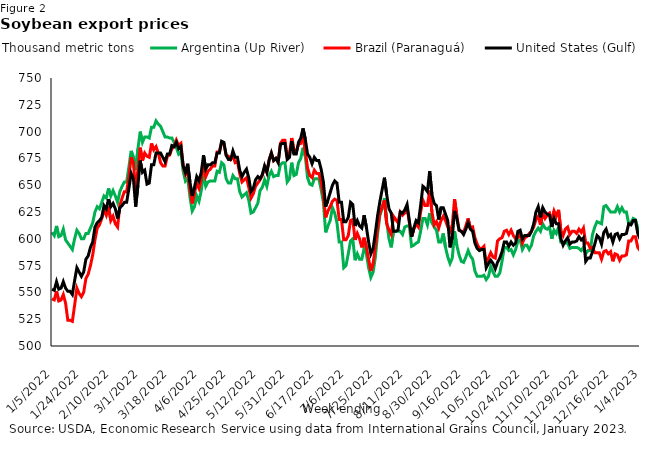
| Category | Argentina (Up River) | Brazil (Paranaguá) | United States (Gulf) |
|---|---|---|---|
| 1/5/22 | 606 | 544 | 553 |
| 1/6/22 | 603 | 543 | 552 |
| 1/7/22 | 612 | 551 | 560 |
| 1/10/22 | 602 | 542 | 553 |
| 1/11/22 | 603 | 543 | 554 |
| 1/12/22 | 609 | 548 | 560 |
| 1/13/22 | 599 | 540 | 554 |
| 1/14/22 | 596 | 524 | 551 |
| 1/17/22 | 593 | 524 | 551 |
| 1/18/22 | 590 | 523 | 548 |
| 1/19/22 | 600 | 538 | 561 |
| 1/20/22 | 608 | 554 | 573 |
| 1/21/22 | 605 | 549 | 569 |
| 1/24/22 | 600 | 546 | 565 |
| 1/25/22 | 600 | 550 | 569 |
| 1/26/22 | 605 | 563 | 581 |
| 1/27/22 | 605 | 567 | 584 |
| 1/28/22 | 610 | 575 | 592 |
| 1/31/22 | 615 | 585 | 597 |
| 2/1/22 | 625 | 599 | 611 |
| 2/2/22 | 630 | 610 | 615 |
| 2/3/22 | 628 | 613 | 617 |
| 2/4/22 | 634 | 619 | 620 |
| 2/7/22 | 640 | 627 | 631 |
| 2/8/22 | 638 | 622 | 628 |
| 2/9/22 | 647 | 630 | 637 |
| 2/10/22 | 640 | 617 | 630 |
| 2/11/22 | 645 | 621 | 633 |
| 2/14/22 | 640 | 614 | 628 |
| 2/15/22 | 634 | 611 | 619 |
| 2/16/22 | 644 | 631 | 629 |
| 2/17/22 | 649 | 638 | 631 |
| 2/18/22 | 653 | 644 | 634 |
| 2/21/22 | 653 | 644 | 634 |
| 2/22/22 | 667 | 658 | 647 |
| 2/23/22 | 682 | 676 | 661 |
| 2/24/22 | 676 | 671 | 656 |
| 2/25/22 | 664 | 645 | 630 |
| 2/28/22 | 684 | 663 | 650 |
| 3/1/22 | 700 | 685 | 673 |
| 3/2/22 | 690 | 673 | 662 |
| 3/3/22 | 695 | 680 | 664 |
| 3/4/22 | 695 | 677 | 651 |
| 3/7/22 | 694 | 676 | 652 |
| 3/8/22 | 704 | 689 | 669 |
| 3/9/22 | 704 | 683 | 669 |
| 3/10/22 | 710 | 686 | 680 |
| 3/11/22 | 707 | 680 | 680 |
| 3/14/22 | 705 | 671 | 680 |
| 3/15/22 | 700 | 668 | 676 |
| 3/16/22 | 695 | 668 | 672 |
| 3/17/22 | 695 | 677 | 679 |
| 3/18/22 | 694 | 678 | 679 |
| 3/21/22 | 694 | 684 | 687 |
| 3/22/22 | 690 | 686 | 686 |
| 3/23/22 | 685 | 692 | 690 |
| 3/24/22 | 679 | 687 | 684 |
| 3/25/22 | 681 | 689 | 686 |
| 3/28/22 | 663 | 668 | 668 |
| 3/29/22 | 654 | 660 | 662 |
| 3/30/22 | 657 | 663 | 670 |
| 3/31/22 | 639 | 646 | 653 |
| 4/1/22 | 626 | 633 | 640 |
| 4/4/22 | 630 | 643 | 648 |
| 4/5/22 | 640 | 652 | 658 |
| 4/6/22 | 635 | 647 | 654 |
| 4/7/22 | 645 | 655 | 662 |
| 4/8/22 | 660 | 669 | 678 |
| 4/11/22 | 649 | 658 | 665 |
| 4/12/22 | 653 | 663 | 669 |
| 4/13/22 | 654 | 665 | 669 |
| 4/14/22 | 654 | 668 | 671 |
| 4/15/22 | 654 | 668 | 671 |
| 4/18/22 | 663 | 681 | 680 |
| 4/19/22 | 662 | 681 | 680 |
| 4/20/22 | 671 | 690 | 691 |
| 4/21/22 | 669 | 689 | 690 |
| 4/22/22 | 656 | 678 | 678 |
| 4/25/22 | 652 | 677 | 674 |
| 4/26/22 | 652 | 674 | 674 |
| 4/27/22 | 659 | 678 | 682 |
| 4/28/22 | 656 | 671 | 676 |
| 4/29/22 | 656 | 672 | 676 |
| 5/2/22 | 644 | 661 | 664 |
| 5/3/22 | 639 | 653 | 658 |
| 5/4/22 | 641 | 655 | 662 |
| 5/5/22 | 643 | 657 | 665 |
| 5/6/22 | 636 | 648 | 657 |
| 5/9/22 | 624 | 638 | 644 |
| 5/10/22 | 625 | 642 | 647 |
| 5/11/22 | 629 | 649 | 655 |
| 5/12/22 | 633 | 652 | 658 |
| 5/13/22 | 645 | 655 | 656 |
| 5/16/22 | 648 | 659 | 660 |
| 5/17/22 | 655 | 667 | 668 |
| 5/18/22 | 649 | 662 | 662 |
| 5/19/22 | 659 | 674 | 673 |
| 5/20/22 | 663 | 680 | 680 |
| 5/23/22 | 658 | 673 | 673 |
| 5/24/22 | 659 | 675 | 675 |
| 5/25/22 | 659 | 672 | 671 |
| 5/26/22 | 669 | 689 | 688 |
| 5/27/22 | 671 | 692 | 689 |
| 5/30/22 | 671 | 692 | 689 |
| 5/31/22 | 653 | 677 | 674 |
| 6/1/22 | 656 | 680 | 676 |
| 6/2/22 | 671 | 694 | 691 |
| 6/3/22 | 659 | 683 | 679 |
| 6/6/22 | 660 | 681 | 679 |
| 6/7/22 | 671 | 688 | 690 |
| 6/8/22 | 675 | 689 | 694 |
| 6/9/22 | 685 | 696 | 703 |
| 6/10/22 | 677 | 682 | 693 |
| 6/13/22 | 657 | 666 | 679 |
| 6/14/22 | 651 | 659 | 676 |
| 6/15/22 | 650 | 657 | 670 |
| 6/16/22 | 656 | 664 | 676 |
| 6/17/22 | 656 | 661 | 673 |
| 6/20/22 | 656 | 661 | 673 |
| 6/21/22 | 646 | 653 | 665 |
| 6/22/22 | 634 | 640 | 653 |
| 6/23/22 | 606 | 620 | 630 |
| 6/24/22 | 612 | 626 | 636 |
| 6/27/22 | 617 | 630 | 643 |
| 6/28/22 | 629 | 635 | 650 |
| 6/29/22 | 624 | 637 | 654 |
| 6/30/22 | 615 | 636 | 652 |
| 7/1/22 | 597 | 618 | 634 |
| 7/4/22 | 597 | 618 | 634 |
| 7/5/22 | 573 | 599 | 616 |
| 7/6/22 | 575 | 599 | 616 |
| 7/7/22 | 586 | 603 | 620 |
| 7/8/22 | 598 | 617 | 634 |
| 7/11/22 | 600 | 618 | 632 |
| 7/12/22 | 580 | 599 | 612 |
| 7/13/22 | 586 | 605 | 617 |
| 7/14/22 | 581 | 600 | 612 |
| 7/15/22 | 581 | 592 | 610 |
| 7/18/22 | 591 | 601 | 622 |
| 7/19/22 | 586 | 592 | 611 |
| 7/20/22 | 573 | 581 | 597 |
| 7/21/22 | 564 | 570 | 586 |
| 7/22/22 | 569 | 577 | 591 |
| 7/25/22 | 583 | 593 | 606 |
| 7/26/22 | 605 | 610 | 622 |
| 7/27/22 | 622 | 624 | 635 |
| 7/28/22 | 628 | 630 | 646 |
| 7/29/22 | 638 | 636 | 657 |
| 8/1/22 | 616 | 614 | 641 |
| 8/2/22 | 600 | 608 | 628 |
| 8/3/22 | 592 | 604 | 624 |
| 8/4/22 | 607 | 621 | 607 |
| 8/5/22 | 607 | 618 | 607 |
| 8/8/22 | 607 | 615 | 608 |
| 8/9/22 | 607 | 625 | 625 |
| 8/10/22 | 604 | 622 | 624 |
| 8/11/22 | 611 | 624 | 627 |
| 8/12/22 | 612 | 629 | 632 |
| 8/15/22 | 612 | 615 | 617 |
| 8/16/22 | 593 | 602 | 602 |
| 8/17/22 | 594 | 609 | 610 |
| 8/18/22 | 596 | 614 | 617 |
| 8/19/22 | 597 | 611 | 615 |
| 8/22/22 | 607 | 625 | 631 |
| 8/23/22 | 619 | 636 | 649 |
| 8/24/22 | 619 | 631 | 647 |
| 8/25/22 | 613 | 631 | 644 |
| 8/26/22 | 624 | 645 | 663 |
| 8/29/22 | 615 | 625 | 641 |
| 8/30/22 | 611 | 613 | 633 |
| 8/31/22 | 608 | 616 | 631 |
| 9/1/22 | 597 | 610 | 618 |
| 9/2/22 | 597 | 617 | 629 |
| 9/5/22 | 605 | 621 | 629 |
| 9/6/22 | 592 | 617 | 623 |
| 9/7/22 | 583 | 611 | 617 |
| 9/8/22 | 577 | 607 | 592 |
| 9/9/22 | 582 | 613 | 602 |
| 9/12/22 | 607 | 637 | 626 |
| 9/13/22 | 594 | 622 | 619 |
| 9/14/22 | 585 | 608 | 608 |
| 9/15/22 | 579 | 607 | 607 |
| 9/16/22 | 578 | 606 | 604 |
| 9/19/22 | 583 | 612 | 609 |
| 9/20/22 | 589 | 619 | 615 |
| 9/21/22 | 584 | 610 | 609 |
| 9/22/22 | 581 | 611 | 607 |
| 9/23/22 | 570 | 601 | 596 |
| 9/26/22 | 565 | 595 | 591 |
| 9/27/22 | 565 | 591 | 589 |
| 9/28/22 | 565 | 591 | 590 |
| 9/29/22 | 566 | 593 | 590 |
| 9/30/22 | 562 | 576 | 573 |
| 10/3/22 | 565 | 582 | 577 |
| 10/4/22 | 574 | 587 | 580 |
| 10/5/22 | 569 | 583 | 577 |
| 10/6/22 | 565 | 582 | 572 |
| 10/7/22 | 565 | 598 | 578 |
| 10/10/22 | 568 | 600 | 582 |
| 10/11/22 | 579 | 601 | 588 |
| 10/12/22 | 592 | 607 | 597 |
| 10/13/22 | 592 | 608 | 597 |
| 10/14/22 | 589 | 604 | 593 |
| 10/17/22 | 590 | 608 | 597 |
| 10/18/22 | 585 | 603 | 594 |
| 10/19/22 | 590 | 600 | 596 |
| 10/20/22 | 598 | 601 | 607 |
| 10/21/22 | 599 | 605 | 608 |
| 10/24/22 | 590 | 596 | 600 |
| 10/25/22 | 594 | 601 | 603 |
| 10/26/22 | 594 | 602 | 603 |
| 10/27/22 | 590 | 605 | 603 |
| 10/28/22 | 594 | 607 | 607 |
| 10/31/22 | 603 | 611 | 614 |
| 11/1/22 | 607 | 618 | 625 |
| 11/2/22 | 610 | 621 | 630 |
| 11/3/22 | 607 | 613 | 620 |
| 11/4/22 | 614 | 624 | 629 |
| 11/7/22 | 610 | 619 | 625 |
| 11/8/22 | 609 | 622 | 623 |
| 11/9/22 | 611 | 624 | 622 |
| 11/10/22 | 600 | 617 | 611 |
| 11/11/22 | 608 | 626 | 619 |
| 11/14/22 | 605 | 621 | 614 |
| 11/15/22 | 611 | 627 | 614 |
| 11/16/22 | 597 | 608 | 600 |
| 11/17/22 | 597 | 603 | 594 |
| 11/18/22 | 596 | 609 | 598 |
| 11/21/22 | 596 | 611 | 601 |
| 11/22/22 | 591 | 604 | 595 |
| 11/23/22 | 592 | 607 | 597 |
| 11/24/22 | 592 | 607 | 597 |
| 11/25/22 | 592 | 605 | 598 |
| 11/28/22 | 591 | 609 | 602 |
| 11/29/22 | 589 | 606 | 599 |
| 11/30/22 | 592 | 610 | 601 |
| 12/1/22 | 586 | 596 | 579 |
| 12/2/22 | 589 | 596 | 582 |
| 12/5/22 | 589 | 591 | 582 |
| 12/6/22 | 604 | 592 | 588 |
| 12/7/22 | 611 | 587 | 595 |
| 12/8/22 | 616 | 587 | 603 |
| 12/9/22 | 615 | 587 | 601 |
| 12/12/22 | 614 | 581 | 595 |
| 12/13/22 | 630 | 588 | 606 |
| 12/14/22 | 631 | 589 | 609 |
| 12/15/22 | 628 | 586 | 602 |
| 12/16/22 | 625 | 588 | 604 |
| 12/19/22 | 625 | 579 | 597 |
| 12/20/22 | 625 | 586 | 604 |
| 12/21/22 | 630 | 585 | 605 |
| 12/22/22 | 625 | 580 | 600 |
| 12/23/22 | 629 | 584 | 604 |
| 12/26/22 | 625 | 584 | 604 |
| 12/27/22 | 625 | 585 | 605 |
| 12/28/22 | 614 | 598 | 614 |
| 12/29/22 | 615 | 598 | 613 |
| 12/30/22 | 619 | 602 | 617 |
| 1/2/23 | 618 | 602 | 617 |
| 1/3/23 | 610 | 592 | 605 |
| 1/4/23 | 606 | 589 | 600 |